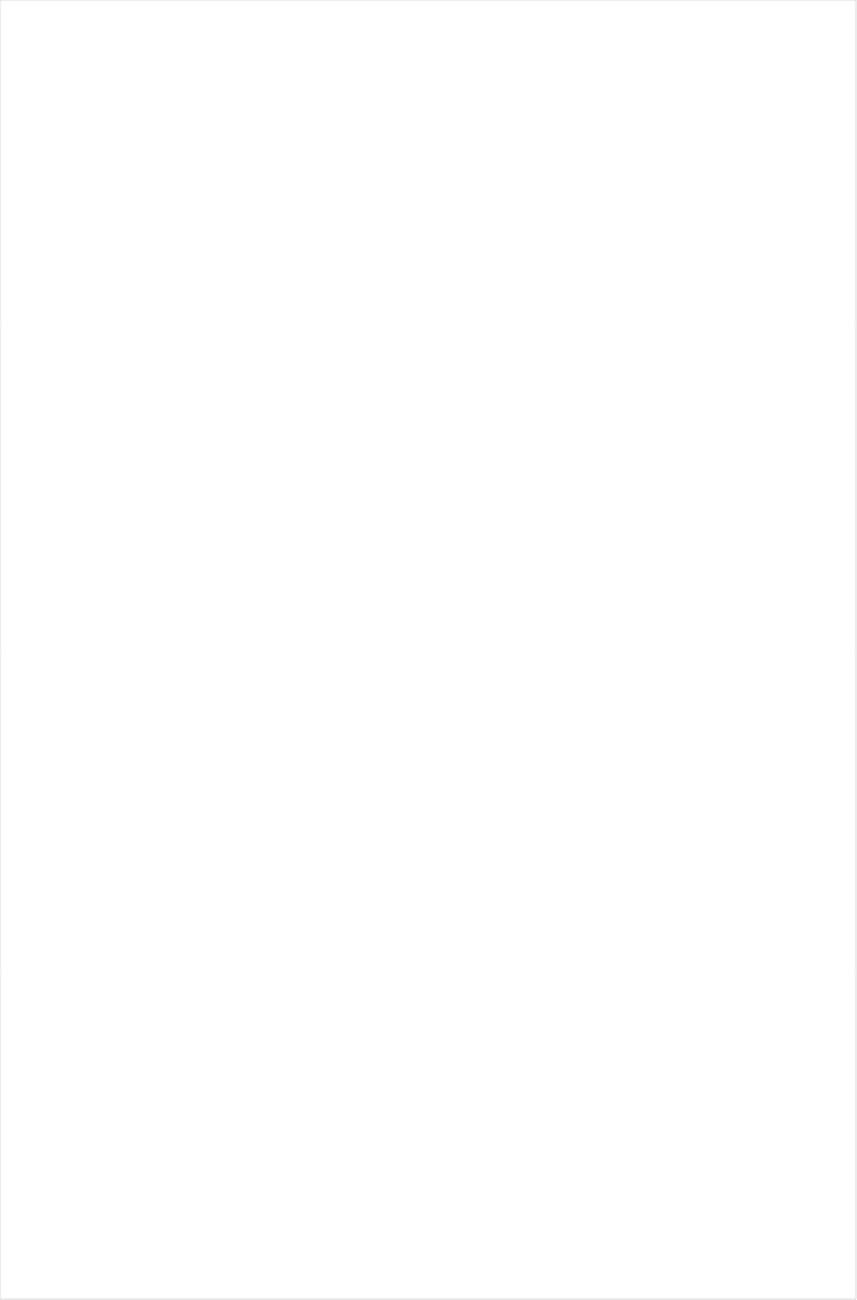
| Category | Total |
|---|---|
| Galavision | -0.924 |
| Univision | -0.884 |
| Telemundo | -0.87 |
| TUDN | -0.852 |
| UniMas | -0.835 |
| NBC Universo | -0.828 |
| BET | -0.805 |
| TV ONE | -0.736 |
| BET Her | -0.718 |
| VH1 | -0.64 |
| Cartoon Network | -0.608 |
| Lifetime Movies | -0.556 |
| Oprah Winfrey Network | -0.48 |
| MTV2 | -0.462 |
| RFD TV | -0.417 |
| Disney Channel | -0.354 |
| WE TV | -0.283 |
| INSP | -0.272 |
| Disney Junior US | -0.271 |
| Nick Jr. | -0.254 |
| Investigation Discovery | -0.249 |
| Nick Toons | -0.238 |
| Hallmark Movies & Mysteries | -0.23 |
| Hallmark | -0.219 |
| Nick | -0.207 |
| TLC | -0.189 |
| Lifetime | -0.155 |
| MyNetworkTV | -0.137 |
| Disney XD | -0.128 |
| Headline News | -0.123 |
| UP TV | -0.097 |
| E! | -0.085 |
| OXYGEN | -0.083 |
| Discovery Family Channel | -0.063 |
| Universal Kids | -0.059 |
| ION | -0.03 |
| CW | 0.011 |
| Great American Country | 0.014 |
| MSNBC | 0.023 |
| POP | 0.025 |
| Adult Swim | 0.043 |
| Game Show | 0.053 |
| Travel | 0.059 |
| BRAVO | 0.061 |
| SYFY | 0.065 |
| Teen Nick | 0.083 |
| FX Movie Channel | 0.09 |
| Nick@Nite | 0.1 |
| NBA TV | 0.101 |
| ABC | 0.102 |
| Fox Business | 0.105 |
| CNN | 0.112 |
| HGTV | 0.112 |
| CMTV | 0.119 |
| TV LAND | 0.13 |
| A&E | 0.142 |
| CBS | 0.154 |
| FXDEP | 0.157 |
| FOX | 0.16 |
| National Geographic Wild | 0.168 |
| Logo | 0.188 |
| MTV | 0.203 |
| Motor Trend Network | 0.218 |
| USA Network | 0.223 |
| Freeform | 0.248 |
| TNT | 0.254 |
| FX | 0.255 |
| Fox News | 0.258 |
| PBS | 0.267 |
| Discovery Channel | 0.269 |
| NBC | 0.284 |
| History Channel | 0.31 |
| Reelz Channel | 0.31 |
| Science Channel | 0.325 |
| Ovation | 0.339 |
| DIY | 0.34 |
| TBS | 0.348 |
| FYI | 0.352 |
| FXX | 0.366 |
| AMC | 0.368 |
| Discovery Life Channel | 0.377 |
| Animal Planet | 0.399 |
| Weather Channel | 0.414 |
| Destination America | 0.422 |
| Paramount Network | 0.431 |
| BBC America | 0.434 |
| Cooking Channel | 0.435 |
| WGN America | 0.437 |
| Food Network | 0.445 |
| American Heroes Channel | 0.504 |
| Bloomberg HD | 0.518 |
| CNBC | 0.529 |
| ESPN Deportes | 0.53 |
| National Geographic | 0.534 |
| Outdoor Channel | 0.544 |
| SundanceTV | 0.545 |
| The Sportsman Channel | 0.626 |
| Smithsonian | 0.639 |
| Comedy Central | 0.715 |
| Viceland | 0.745 |
| ESPN2 | 0.786 |
| truTV | 0.795 |
| ESPN | 0.927 |
| Independent Film (IFC) | 0.943 |
| PAC-12 Network | 1.051 |
| Tennis Channel | 1.108 |
| NFL Network | 1.163 |
| ESPNEWS | 1.336 |
| ESPNU | 1.438 |
| Olympic Channel | 1.593 |
| Fox Sports 1 | 1.616 |
| CBS Sports | 1.745 |
| FOX Sports 2 | 1.9 |
| Golf | 1.952 |
| MLB Network | 2.525 |
| Big Ten Network | 2.807 |
| NBC Sports | 2.826 |
| NHL | 16.513 |